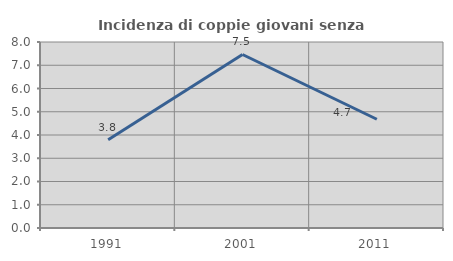
| Category | Incidenza di coppie giovani senza figli |
|---|---|
| 1991.0 | 3.797 |
| 2001.0 | 7.463 |
| 2011.0 | 4.678 |